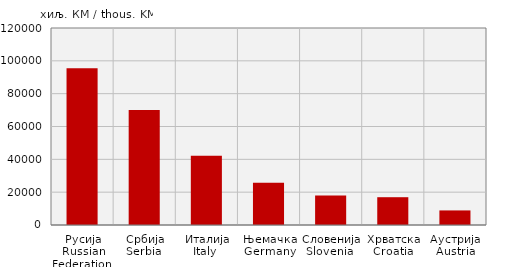
| Category | Увоз
Import |
|---|---|
| Русија
Russian Federation  | 95443 |
| Србија
Serbia  | 70048 |
| Италија
Italy  | 42164 |
| Њемачка
Germany | 25676 |
| Словенија
Slovenia  | 17971 |
| Хрватска
Croatia | 16930 |
| Аустрија
Austria | 8877 |